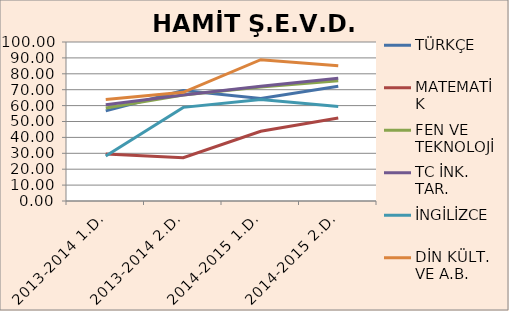
| Category | TÜRKÇE | MATEMATİK | FEN VE TEKNOLOJİ | TC İNK. TAR. | İNGİLİZCE | DİN KÜLT. VE A.B. |
|---|---|---|---|---|---|---|
| 2013-2014 1.D. | 56.67 | 29.63 | 58.48 | 60.56 | 28.33 | 63.89 |
| 2013-2014 2.D. | 69.44 | 27.22 | 66.67 | 66.67 | 58.89 | 68.33 |
| 2014-2015 1.D. | 64.44 | 43.89 | 71.67 | 72.22 | 63.89 | 88.89 |
| 2014-2015 2.D. | 72.22 | 52.22 | 75.56 | 77.22 | 59.44 | 85 |